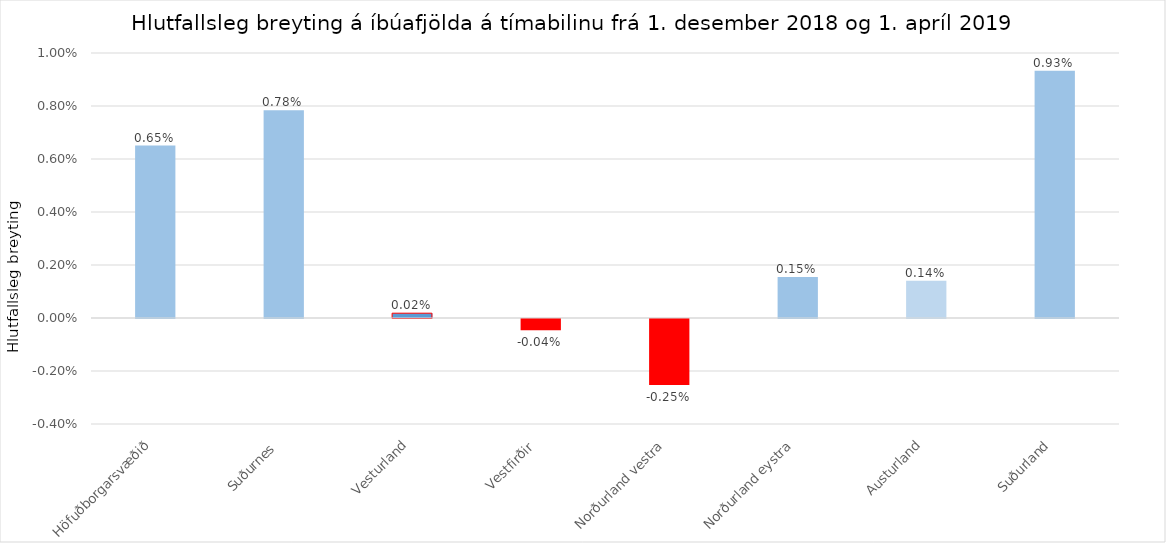
| Category | Series 0 |
|---|---|
| Höfuðborgarsvæðið | 0.007 |
| Suðurnes  | 0.008 |
| Vesturland | 0 |
| Vestfirðir  | 0 |
| Norðurland vestra | -0.002 |
| Norðurland eystra | 0.002 |
| Austurland | 0.001 |
| Suðurland | 0.009 |